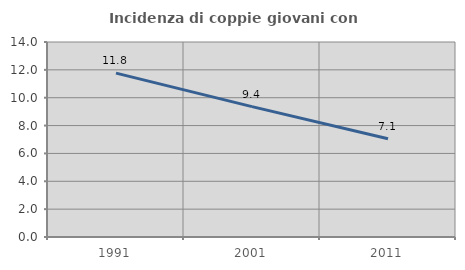
| Category | Incidenza di coppie giovani con figli |
|---|---|
| 1991.0 | 11.765 |
| 2001.0 | 9.36 |
| 2011.0 | 7.059 |